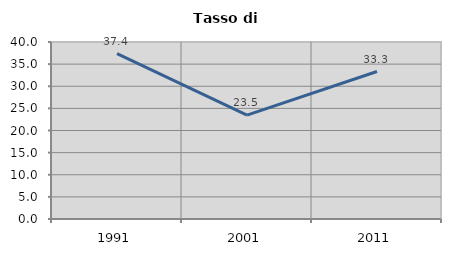
| Category | Tasso di disoccupazione   |
|---|---|
| 1991.0 | 37.366 |
| 2001.0 | 23.482 |
| 2011.0 | 33.333 |